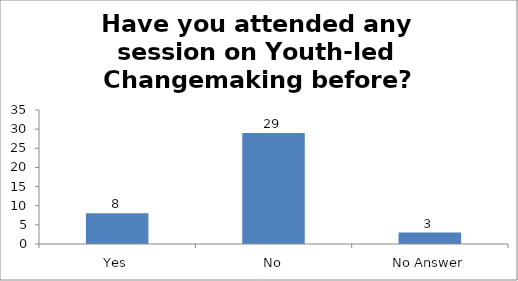
| Category | Have you attended any session on Youth-led Changemaking before? |
|---|---|
| Yes | 8 |
| No | 29 |
| No Answer | 3 |